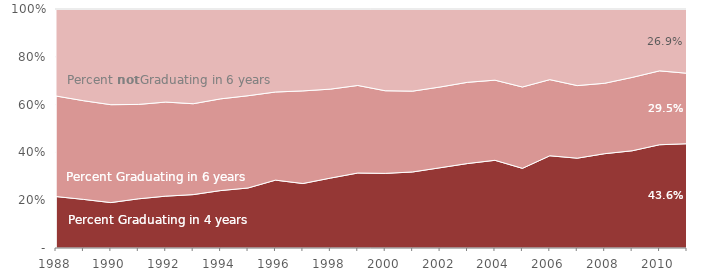
| Category | Series 0 | Series 1 | Series 2 |
|---|---|---|---|
| 1988.0 | 0.215 | 0.421 | 0.364 |
| 1989.0 | 0.203 | 0.413 | 0.384 |
| 1990.0 | 0.19 | 0.41 | 0.4 |
| 1991.0 | 0.206 | 0.395 | 0.399 |
| 1992.0 | 0.217 | 0.394 | 0.389 |
| 1993.0 | 0.223 | 0.38 | 0.396 |
| 1994.0 | 0.24 | 0.384 | 0.376 |
| 1995.0 | 0.251 | 0.386 | 0.363 |
| 1996.0 | 0.284 | 0.369 | 0.347 |
| 1997.0 | 0.27 | 0.388 | 0.343 |
| 1998.0 | 0.292 | 0.372 | 0.335 |
| 1999.0 | 0.314 | 0.366 | 0.32 |
| 2000.0 | 0.312 | 0.346 | 0.342 |
| 2001.0 | 0.318 | 0.338 | 0.344 |
| 2002.0 | 0.336 | 0.338 | 0.326 |
| 2003.0 | 0.353 | 0.34 | 0.307 |
| 2004.0 | 0.367 | 0.335 | 0.298 |
| 2005.0 | 0.333 | 0.34 | 0.326 |
| 2006.0 | 0.386 | 0.319 | 0.296 |
| 2007.0 | 0.376 | 0.304 | 0.32 |
| 2008.0 | 0.395 | 0.295 | 0.311 |
| 2009.0 | 0.407 | 0.307 | 0.286 |
| 2010.0 | 0.432 | 0.309 | 0.259 |
| 2011.0 | 0.436 | 0.295 | 0.269 |